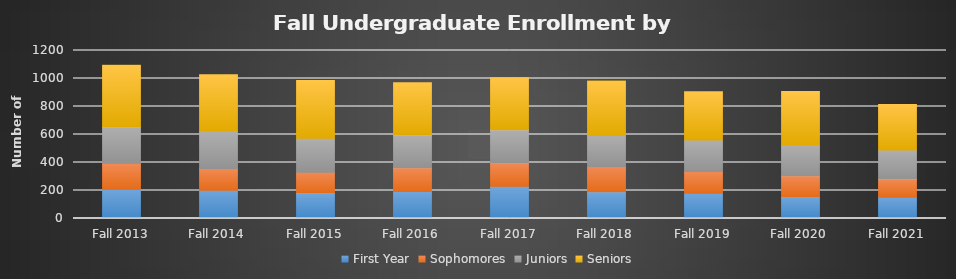
| Category | First Year | Sophomores | Juniors | Seniors |
|---|---|---|---|---|
| Fall 2013 | 209 | 186 | 261 | 439 |
| Fall 2014 | 201 | 156 | 268 | 401 |
| Fall 2015 | 183 | 148 | 243 | 412 |
| Fall 2016 | 192 | 170 | 236 | 372 |
| Fall 2017 | 230 | 169 | 235 | 371 |
| Fall 2018 | 191 | 181 | 223 | 387 |
| Fall 2019 | 180 | 155 | 225 | 346 |
| Fall 2020 | 155 | 151 | 219 | 382 |
| Fall 2021 | 152 | 131 | 206 | 326 |